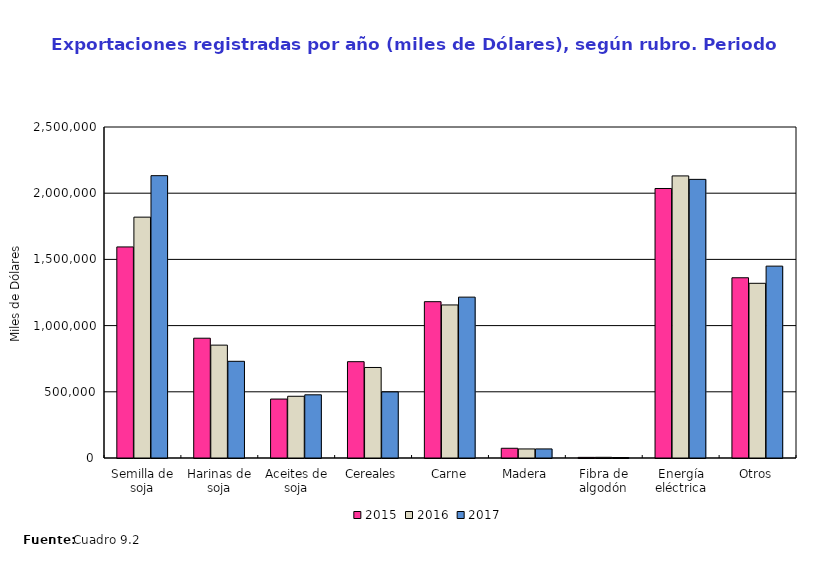
| Category | 2015 | 2016 | 2017 |
|---|---|---|---|
| Semilla de soja | 1594197.533 | 1819082 | 2132416.622 |
| Harinas de soja | 904718.547 | 852469 | 730287.119 |
| Aceites de soja | 445191.299 | 466160 | 477129.927 |
| Cereales | 727487.442 | 683767 | 499181.499 |
| Carne | 1180682.706 | 1156056 | 1215033.133 |
| Madera | 73518.112 | 68417 | 68549.862 |
| Fibra de algodón | 4826.033 | 5254 | 3574.624 |
| Energía eléctrica | 2035598.534 | 2130505 | 2104509.852 |
| Otros | 1361326.309 | 1319487 | 1449150.402 |